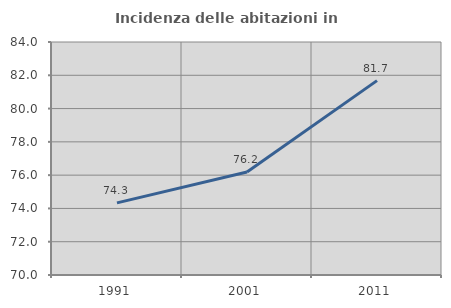
| Category | Incidenza delle abitazioni in proprietà  |
|---|---|
| 1991.0 | 74.333 |
| 2001.0 | 76.185 |
| 2011.0 | 81.68 |